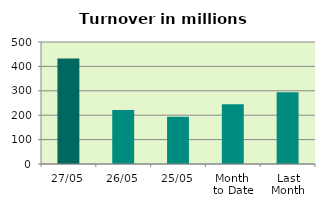
| Category | Series 0 |
|---|---|
| 27/05 | 432.121 |
| 26/05 | 220.946 |
| 25/05 | 193.425 |
| Month 
to Date | 245.254 |
| Last
Month | 294.539 |